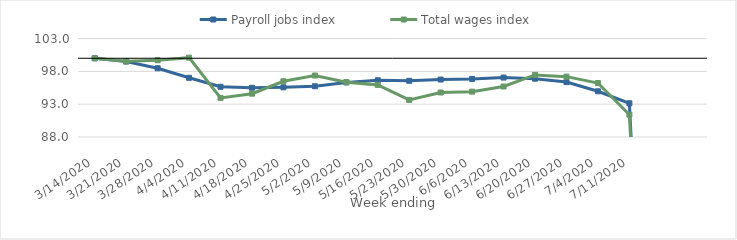
| Category | Payroll jobs index | Total wages index |
|---|---|---|
| 14/03/2020 | 100 | 100 |
| 21/03/2020 | 99.495 | 99.531 |
| 28/03/2020 | 98.478 | 99.694 |
| 04/04/2020 | 97.02 | 100.087 |
| 11/04/2020 | 95.65 | 93.963 |
| 18/04/2020 | 95.5 | 94.603 |
| 25/04/2020 | 95.571 | 96.491 |
| 02/05/2020 | 95.734 | 97.365 |
| 09/05/2020 | 96.312 | 96.358 |
| 16/05/2020 | 96.646 | 95.939 |
| 23/05/2020 | 96.563 | 93.65 |
| 30/05/2020 | 96.756 | 94.781 |
| 06/06/2020 | 96.851 | 94.908 |
| 13/06/2020 | 97.056 | 95.692 |
| 20/06/2020 | 96.887 | 97.463 |
| 27/06/2020 | 96.366 | 97.198 |
| 04/07/2020 | 94.965 | 96.225 |
| 11/07/2020 | 93.138 | 91.412 |